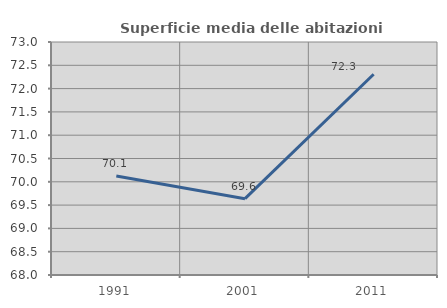
| Category | Superficie media delle abitazioni occupate |
|---|---|
| 1991.0 | 70.124 |
| 2001.0 | 69.638 |
| 2011.0 | 72.308 |